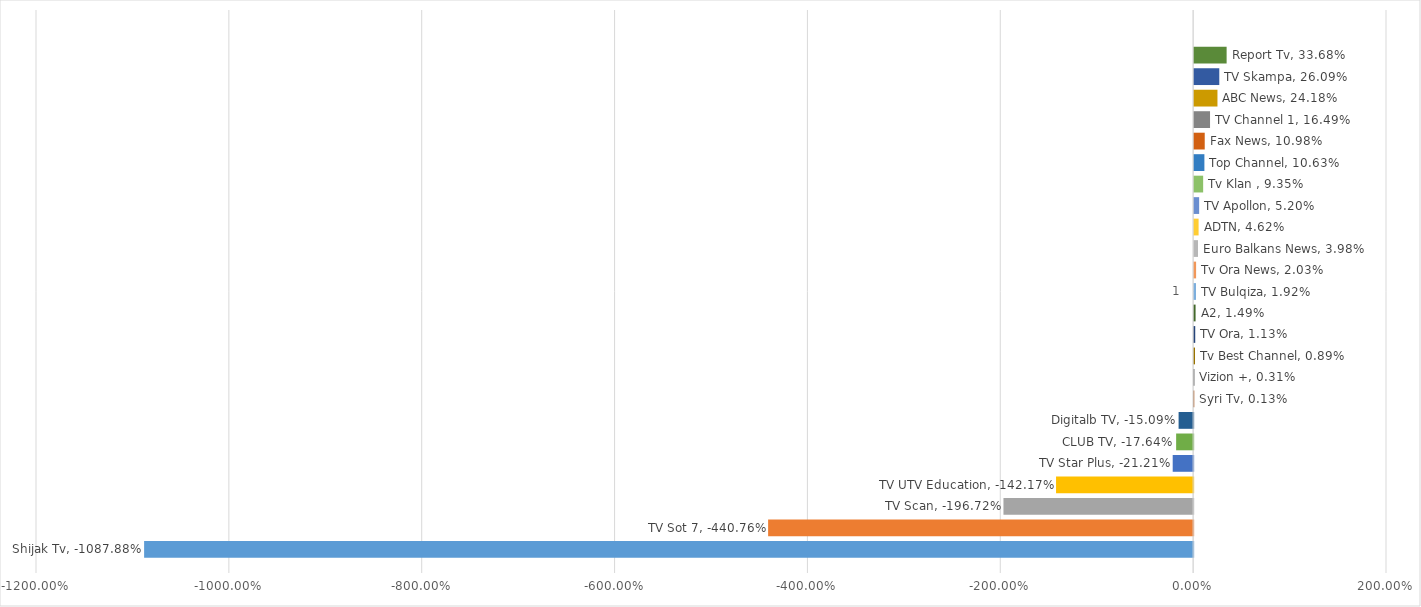
| Category | Shijak Tv | TV Sot 7 | TV Scan | TV UTV Education | TV Star Plus | CLUB TV | Digitalb TV | Syri Tv | Vizion + | Tv Best Channel | TV Ora | A2 | TV Bulqiza | Tv Ora News | Euro Balkans News | ADTN | TV Apollon | Tv Klan  | Top Channel | Fax News | TV Channel 1 | ABC News | TV Skampa | Report Tv | TVT |
|---|---|---|---|---|---|---|---|---|---|---|---|---|---|---|---|---|---|---|---|---|---|---|---|---|---|
| 0 | -10.879 | -4.408 | -1.967 | -1.422 | -0.212 | -0.176 | -0.151 | 0.001 | 0.003 | 0.009 | 0.011 | 0.015 | 0.019 | 0.02 | 0.04 | 0.046 | 0.052 | 0.093 | 0.106 | 0.11 | 0.165 | 0.242 | 0.261 | 0.337 | 0 |